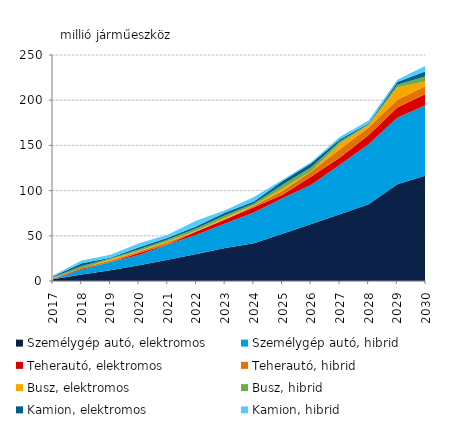
| Category | Személygép autó, elektromos | Személygép autó, hibrid | Teherautó, elektromos | Teherautó, hibrid | Busz, elektromos | Busz, hibrid | Kamion, elektromos | Kamion, hibrid |
|---|---|---|---|---|---|---|---|---|
| 2017.0 | 2.064 | 0.029 | 0.407 | 0.5 | 0.5 | 0.738 | 0.738 | 1.223 |
| 2018.0 | 7.136 | 5.291 | 1.221 | 0.763 | -0.607 | 2.894 | 2.894 | 3.048 |
| 2019.0 | 11.851 | 9.083 | 0.157 | 1.524 | 1.525 | 0.767 | 0.767 | 3.357 |
| 2020.0 | 17.301 | 11.382 | 2.289 | 1.526 | 0.616 | 2.138 | 2.138 | 4.27 |
| 2021.0 | 23.487 | 16.765 | 0.461 | 2.138 | 1.069 | 1.986 | 1.986 | 3.359 |
| 2022.0 | 29.857 | 21.2 | 3.667 | 0.464 | 0.764 | 2.292 | 2.292 | 6.407 |
| 2023.0 | 36.597 | 27.101 | 4.43 | 0.314 | 1.529 | 2.897 | 2.897 | 2.598 |
| 2024.0 | 41.882 | 33.851 | 5.958 | 1.534 | 0.459 | 2.139 | 2.139 | 5.038 |
| 2025.0 | 52.282 | 39.148 | 3.981 | 4.435 | 2.441 | 4.121 | 4.121 | 1.531 |
| 2026.0 | 63.057 | 43.467 | 9.016 | 5.657 | 0.157 | 4.427 | 4.427 | 1.532 |
| 2027.0 | 73.836 | 54.653 | 8.106 | 9.322 | 6.262 | 2.292 | 2.292 | 2.905 |
| 2028.0 | 84.807 | 66.573 | 10.243 | 8.103 | 2.906 | 0.918 | 0.918 | 3.059 |
| 2029.0 | 107.132 | 73.404 | 11.316 | 8.716 | 13.442 | 3.057 | 3.057 | 2.448 |
| 2030.0 | 116.651 | 77.929 | 12.541 | 8.869 | 5.045 | 5.613 | 5.613 | 6 |